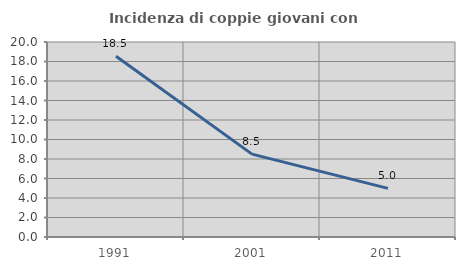
| Category | Incidenza di coppie giovani con figli |
|---|---|
| 1991.0 | 18.546 |
| 2001.0 | 8.5 |
| 2011.0 | 4.987 |